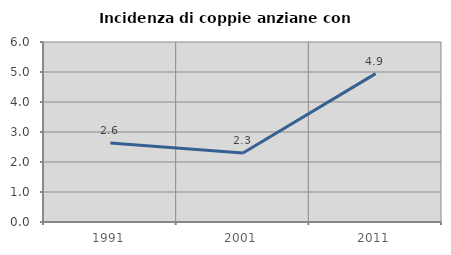
| Category | Incidenza di coppie anziane con figli |
|---|---|
| 1991.0 | 2.632 |
| 2001.0 | 2.303 |
| 2011.0 | 4.947 |